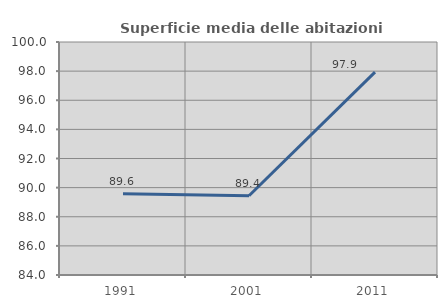
| Category | Superficie media delle abitazioni occupate |
|---|---|
| 1991.0 | 89.579 |
| 2001.0 | 89.444 |
| 2011.0 | 97.93 |